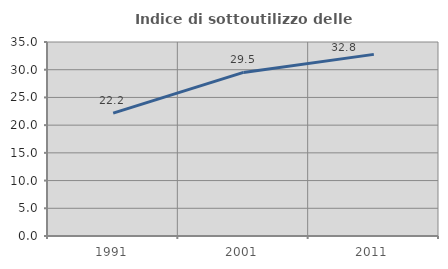
| Category | Indice di sottoutilizzo delle abitazioni  |
|---|---|
| 1991.0 | 22.16 |
| 2001.0 | 29.508 |
| 2011.0 | 32.766 |